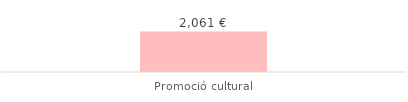
| Category | Total |
|---|---|
| Promoció cultural | 2060.63 |